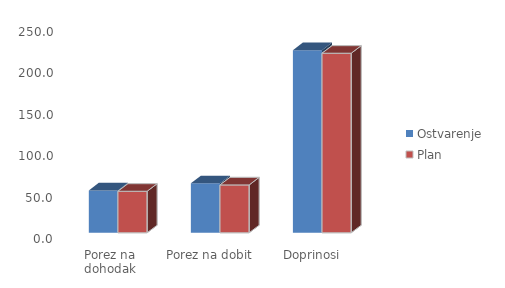
| Category | Ostvarenje | Plan |
|---|---|---|
| Porez na dohodak | 51122438.96 | 50118940.617 |
| Porez na dobit  | 59697131.34 | 57763326.645 |
| Doprinosi  | 220406123.72 | 216723266.167 |